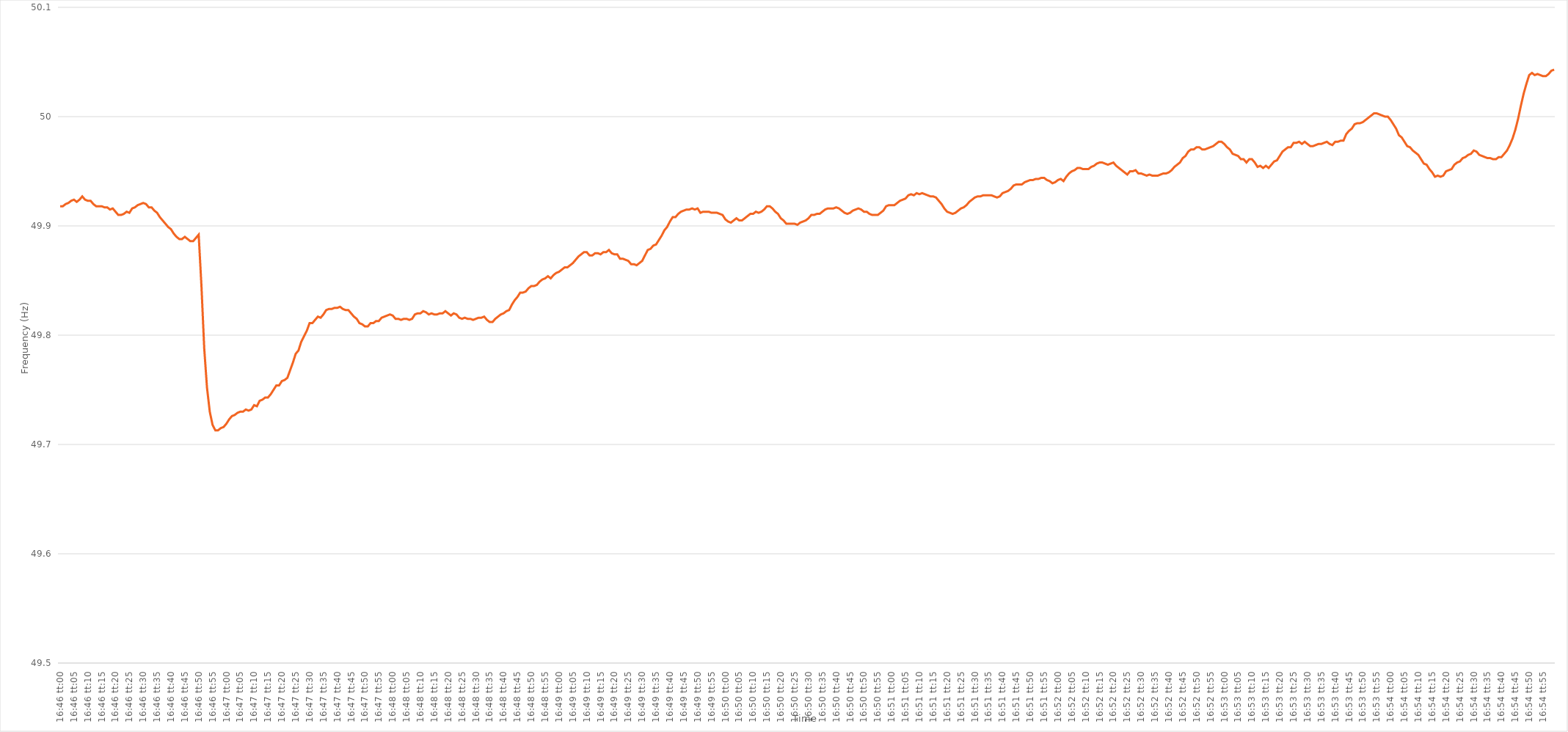
| Category | Series 0 |
|---|---|
| 0.6986111111111111 | 49.918 |
| 0.6986226851851852 | 49.918 |
| 0.6986342592592593 | 49.92 |
| 0.6986458333333333 | 49.921 |
| 0.6986574074074073 | 49.923 |
| 0.6986689814814815 | 49.924 |
| 0.6986805555555556 | 49.922 |
| 0.6986921296296296 | 49.924 |
| 0.6987037037037037 | 49.927 |
| 0.6987152777777778 | 49.924 |
| 0.6987268518518519 | 49.923 |
| 0.6987384259259258 | 49.923 |
| 0.69875 | 49.92 |
| 0.6987615740740741 | 49.918 |
| 0.6987731481481482 | 49.918 |
| 0.6987847222222222 | 49.918 |
| 0.6987962962962962 | 49.917 |
| 0.6988078703703704 | 49.917 |
| 0.6988194444444445 | 49.915 |
| 0.6988310185185185 | 49.916 |
| 0.6988425925925926 | 49.913 |
| 0.6988541666666667 | 49.91 |
| 0.6988657407407407 | 49.91 |
| 0.6988773148148147 | 49.911 |
| 0.6988888888888889 | 49.913 |
| 0.698900462962963 | 49.912 |
| 0.698912037037037 | 49.916 |
| 0.6989236111111111 | 49.917 |
| 0.6989351851851852 | 49.919 |
| 0.6989467592592593 | 49.92 |
| 0.6989583333333332 | 49.921 |
| 0.6989699074074074 | 49.92 |
| 0.6989814814814815 | 49.917 |
| 0.6989930555555556 | 49.917 |
| 0.6990046296296296 | 49.914 |
| 0.6990162037037037 | 49.912 |
| 0.6990277777777778 | 49.908 |
| 0.699039351851852 | 49.905 |
| 0.6990509259259259 | 49.902 |
| 0.6990625 | 49.899 |
| 0.6990740740740741 | 49.897 |
| 0.6990856481481481 | 49.893 |
| 0.6990972222222221 | 49.89 |
| 0.6991087962962963 | 49.888 |
| 0.6991203703703704 | 49.888 |
| 0.6991319444444444 | 49.89 |
| 0.6991435185185185 | 49.888 |
| 0.6991550925925926 | 49.886 |
| 0.6991666666666667 | 49.886 |
| 0.6991782407407406 | 49.889 |
| 0.6991898148148148 | 49.892 |
| 0.6992013888888889 | 49.845 |
| 0.699212962962963 | 49.788 |
| 0.699224537037037 | 49.752 |
| 0.6992361111111111 | 49.73 |
| 0.6992476851851852 | 49.718 |
| 0.6992592592592594 | 49.713 |
| 0.6992708333333333 | 49.713 |
| 0.6992824074074074 | 49.715 |
| 0.6992939814814815 | 49.716 |
| 0.6993055555555556 | 49.719 |
| 0.6993171296296296 | 49.723 |
| 0.6993287037037037 | 49.726 |
| 0.6993402777777779 | 49.727 |
| 0.6993518518518519 | 49.729 |
| 0.6993634259259259 | 49.73 |
| 0.699375 | 49.73 |
| 0.6993865740740741 | 49.732 |
| 0.699398148148148 | 49.731 |
| 0.6994097222222222 | 49.732 |
| 0.6994212962962963 | 49.736 |
| 0.6994328703703704 | 49.735 |
| 0.6994444444444444 | 49.74 |
| 0.6994560185185185 | 49.741 |
| 0.6994675925925926 | 49.743 |
| 0.6994791666666668 | 49.743 |
| 0.6994907407407407 | 49.746 |
| 0.6995023148148148 | 49.75 |
| 0.6995138888888889 | 49.754 |
| 0.699525462962963 | 49.754 |
| 0.699537037037037 | 49.758 |
| 0.6995486111111111 | 49.759 |
| 0.6995601851851853 | 49.761 |
| 0.6995717592592593 | 49.768 |
| 0.6995833333333333 | 49.775 |
| 0.6995949074074074 | 49.783 |
| 0.6996064814814815 | 49.786 |
| 0.6996180555555555 | 49.794 |
| 0.6996296296296296 | 49.799 |
| 0.6996412037037038 | 49.804 |
| 0.6996527777777778 | 49.811 |
| 0.6996643518518518 | 49.811 |
| 0.6996759259259259 | 49.814 |
| 0.6996875 | 49.817 |
| 0.6996990740740742 | 49.816 |
| 0.6997106481481481 | 49.819 |
| 0.6997222222222222 | 49.823 |
| 0.6997337962962963 | 49.824 |
| 0.6997453703703704 | 49.824 |
| 0.6997569444444444 | 49.825 |
| 0.6997685185185185 | 49.825 |
| 0.6997800925925927 | 49.826 |
| 0.6997916666666667 | 49.824 |
| 0.6998032407407407 | 49.823 |
| 0.6998148148148148 | 49.823 |
| 0.6998263888888889 | 49.82 |
| 0.6998379629629629 | 49.817 |
| 0.699849537037037 | 49.815 |
| 0.6998611111111112 | 49.811 |
| 0.6998726851851852 | 49.81 |
| 0.6998842592592592 | 49.808 |
| 0.6998958333333333 | 49.808 |
| 0.6999074074074074 | 49.811 |
| 0.6999189814814816 | 49.811 |
| 0.6999305555555555 | 49.813 |
| 0.6999421296296297 | 49.813 |
| 0.6999537037037037 | 49.816 |
| 0.6999652777777778 | 49.817 |
| 0.6999768518518518 | 49.818 |
| 0.6999884259259259 | 49.819 |
| 0.7000000000000001 | 49.818 |
| 0.7000115740740741 | 49.815 |
| 0.7000231481481481 | 49.815 |
| 0.7000347222222222 | 49.814 |
| 0.7000462962962963 | 49.815 |
| 0.7000578703703703 | 49.815 |
| 0.7000694444444444 | 49.814 |
| 0.7000810185185186 | 49.815 |
| 0.7000925925925926 | 49.819 |
| 0.7001041666666666 | 49.82 |
| 0.7001157407407407 | 49.82 |
| 0.7001273148148148 | 49.822 |
| 0.700138888888889 | 49.821 |
| 0.7001504629629629 | 49.819 |
| 0.700162037037037 | 49.82 |
| 0.7001736111111111 | 49.819 |
| 0.7001851851851852 | 49.819 |
| 0.7001967592592592 | 49.82 |
| 0.7002083333333333 | 49.82 |
| 0.7002199074074075 | 49.822 |
| 0.7002314814814815 | 49.82 |
| 0.7002430555555555 | 49.818 |
| 0.7002546296296296 | 49.82 |
| 0.7002662037037037 | 49.819 |
| 0.7002777777777777 | 49.816 |
| 0.7002893518518518 | 49.815 |
| 0.700300925925926 | 49.816 |
| 0.7003125 | 49.815 |
| 0.700324074074074 | 49.815 |
| 0.7003356481481481 | 49.814 |
| 0.7003472222222222 | 49.815 |
| 0.7003587962962964 | 49.816 |
| 0.7003703703703703 | 49.816 |
| 0.7003819444444445 | 49.817 |
| 0.7003935185185185 | 49.814 |
| 0.7004050925925926 | 49.812 |
| 0.7004166666666666 | 49.812 |
| 0.7004282407407407 | 49.815 |
| 0.7004398148148149 | 49.817 |
| 0.7004513888888889 | 49.819 |
| 0.700462962962963 | 49.82 |
| 0.700474537037037 | 49.822 |
| 0.7004861111111111 | 49.823 |
| 0.7004976851851853 | 49.828 |
| 0.7005092592592592 | 49.832 |
| 0.7005208333333334 | 49.835 |
| 0.7005324074074074 | 49.839 |
| 0.7005439814814814 | 49.839 |
| 0.7005555555555555 | 49.84 |
| 0.7005671296296296 | 49.843 |
| 0.7005787037037038 | 49.845 |
| 0.7005902777777777 | 49.845 |
| 0.7006018518518519 | 49.846 |
| 0.7006134259259259 | 49.849 |
| 0.700625 | 49.851 |
| 0.700636574074074 | 49.852 |
| 0.7006481481481481 | 49.854 |
| 0.7006597222222223 | 49.852 |
| 0.7006712962962963 | 49.855 |
| 0.7006828703703704 | 49.857 |
| 0.7006944444444444 | 49.858 |
| 0.7007060185185185 | 49.86 |
| 0.7007175925925927 | 49.862 |
| 0.7007291666666666 | 49.862 |
| 0.7007407407407408 | 49.864 |
| 0.7007523148148148 | 49.866 |
| 0.700763888888889 | 49.869 |
| 0.7007754629629629 | 49.872 |
| 0.700787037037037 | 49.874 |
| 0.7007986111111112 | 49.876 |
| 0.7008101851851851 | 49.876 |
| 0.7008217592592593 | 49.873 |
| 0.7008333333333333 | 49.873 |
| 0.7008449074074075 | 49.875 |
| 0.7008564814814814 | 49.875 |
| 0.7008680555555555 | 49.874 |
| 0.7008796296296297 | 49.876 |
| 0.7008912037037037 | 49.876 |
| 0.7009027777777778 | 49.878 |
| 0.7009143518518518 | 49.875 |
| 0.700925925925926 | 49.874 |
| 0.7009375000000001 | 49.874 |
| 0.700949074074074 | 49.87 |
| 0.7009606481481482 | 49.87 |
| 0.7009722222222222 | 49.869 |
| 0.7009837962962964 | 49.868 |
| 0.7009953703703703 | 49.865 |
| 0.7010069444444444 | 49.865 |
| 0.7010185185185186 | 49.864 |
| 0.7010300925925925 | 49.866 |
| 0.7010416666666667 | 49.868 |
| 0.7010532407407407 | 49.873 |
| 0.7010648148148149 | 49.878 |
| 0.7010763888888888 | 49.879 |
| 0.7010879629629629 | 49.882 |
| 0.7010995370370371 | 49.883 |
| 0.7011111111111111 | 49.887 |
| 0.7011226851851852 | 49.891 |
| 0.7011342592592592 | 49.896 |
| 0.7011458333333334 | 49.899 |
| 0.7011574074074075 | 49.904 |
| 0.7011689814814814 | 49.908 |
| 0.7011805555555556 | 49.908 |
| 0.7011921296296296 | 49.911 |
| 0.7012037037037038 | 49.913 |
| 0.7012152777777777 | 49.914 |
| 0.7012268518518519 | 49.915 |
| 0.701238425925926 | 49.915 |
| 0.7012499999999999 | 49.916 |
| 0.7012615740740741 | 49.915 |
| 0.7012731481481481 | 49.916 |
| 0.7012847222222223 | 49.912 |
| 0.7012962962962962 | 49.913 |
| 0.7013078703703703 | 49.913 |
| 0.7013194444444445 | 49.913 |
| 0.7013310185185185 | 49.912 |
| 0.7013425925925926 | 49.912 |
| 0.7013541666666666 | 49.912 |
| 0.7013657407407408 | 49.911 |
| 0.7013773148148149 | 49.91 |
| 0.7013888888888888 | 49.906 |
| 0.701400462962963 | 49.904 |
| 0.701412037037037 | 49.903 |
| 0.7014236111111112 | 49.905 |
| 0.7014351851851851 | 49.907 |
| 0.7014467592592593 | 49.905 |
| 0.7014583333333334 | 49.905 |
| 0.7014699074074073 | 49.907 |
| 0.7014814814814815 | 49.909 |
| 0.7014930555555555 | 49.911 |
| 0.7015046296296297 | 49.911 |
| 0.7015162037037036 | 49.913 |
| 0.7015277777777778 | 49.912 |
| 0.7015393518518519 | 49.913 |
| 0.7015509259259259 | 49.915 |
| 0.7015625 | 49.918 |
| 0.701574074074074 | 49.918 |
| 0.7015856481481482 | 49.916 |
| 0.7015972222222223 | 49.913 |
| 0.7016087962962962 | 49.911 |
| 0.7016203703703704 | 49.907 |
| 0.7016319444444444 | 49.905 |
| 0.7016435185185186 | 49.902 |
| 0.7016550925925925 | 49.902 |
| 0.7016666666666667 | 49.902 |
| 0.7016782407407408 | 49.902 |
| 0.7016898148148147 | 49.901 |
| 0.7017013888888889 | 49.903 |
| 0.7017129629629629 | 49.904 |
| 0.7017245370370371 | 49.905 |
| 0.701736111111111 | 49.907 |
| 0.7017476851851852 | 49.91 |
| 0.7017592592592593 | 49.91 |
| 0.7017708333333333 | 49.911 |
| 0.7017824074074074 | 49.911 |
| 0.7017939814814814 | 49.913 |
| 0.7018055555555556 | 49.915 |
| 0.7018171296296297 | 49.916 |
| 0.7018287037037036 | 49.916 |
| 0.7018402777777778 | 49.916 |
| 0.7018518518518518 | 49.917 |
| 0.701863425925926 | 49.916 |
| 0.7018749999999999 | 49.914 |
| 0.7018865740740741 | 49.912 |
| 0.7018981481481482 | 49.911 |
| 0.7019097222222223 | 49.912 |
| 0.7019212962962963 | 49.914 |
| 0.7019328703703703 | 49.915 |
| 0.7019444444444445 | 49.916 |
| 0.7019560185185186 | 49.915 |
| 0.7019675925925926 | 49.913 |
| 0.7019791666666667 | 49.913 |
| 0.7019907407407407 | 49.911 |
| 0.7020023148148148 | 49.91 |
| 0.7020138888888888 | 49.91 |
| 0.702025462962963 | 49.91 |
| 0.7020370370370371 | 49.912 |
| 0.702048611111111 | 49.914 |
| 0.7020601851851852 | 49.918 |
| 0.7020717592592592 | 49.919 |
| 0.7020833333333334 | 49.919 |
| 0.7020949074074073 | 49.919 |
| 0.7021064814814815 | 49.921 |
| 0.7021180555555556 | 49.923 |
| 0.7021296296296297 | 49.924 |
| 0.7021412037037037 | 49.925 |
| 0.7021527777777777 | 49.928 |
| 0.7021643518518519 | 49.929 |
| 0.702175925925926 | 49.928 |
| 0.7021875 | 49.93 |
| 0.7021990740740741 | 49.929 |
| 0.7022106481481482 | 49.93 |
| 0.7022222222222222 | 49.929 |
| 0.7022337962962962 | 49.928 |
| 0.7022453703703704 | 49.927 |
| 0.7022569444444445 | 49.927 |
| 0.7022685185185185 | 49.926 |
| 0.7022800925925926 | 49.923 |
| 0.7022916666666666 | 49.92 |
| 0.7023032407407408 | 49.916 |
| 0.7023148148148147 | 49.913 |
| 0.7023263888888889 | 49.912 |
| 0.702337962962963 | 49.911 |
| 0.7023495370370371 | 49.912 |
| 0.7023611111111111 | 49.914 |
| 0.7023726851851851 | 49.916 |
| 0.7023842592592593 | 49.917 |
| 0.7023958333333334 | 49.919 |
| 0.7024074074074074 | 49.922 |
| 0.7024189814814815 | 49.924 |
| 0.7024305555555556 | 49.926 |
| 0.7024421296296296 | 49.927 |
| 0.7024537037037036 | 49.927 |
| 0.7024652777777778 | 49.928 |
| 0.7024768518518519 | 49.928 |
| 0.7024884259259259 | 49.928 |
| 0.7025 | 49.928 |
| 0.702511574074074 | 49.927 |
| 0.7025231481481482 | 49.926 |
| 0.7025347222222221 | 49.927 |
| 0.7025462962962963 | 49.93 |
| 0.7025578703703704 | 49.931 |
| 0.7025694444444445 | 49.932 |
| 0.7025810185185185 | 49.934 |
| 0.7025925925925925 | 49.937 |
| 0.7026041666666667 | 49.938 |
| 0.7026157407407408 | 49.938 |
| 0.7026273148148148 | 49.938 |
| 0.7026388888888889 | 49.94 |
| 0.702650462962963 | 49.941 |
| 0.702662037037037 | 49.942 |
| 0.702673611111111 | 49.942 |
| 0.7026851851851852 | 49.943 |
| 0.7026967592592593 | 49.943 |
| 0.7027083333333333 | 49.944 |
| 0.7027199074074074 | 49.944 |
| 0.7027314814814815 | 49.942 |
| 0.7027430555555556 | 49.941 |
| 0.7027546296296295 | 49.939 |
| 0.7027662037037037 | 49.94 |
| 0.7027777777777778 | 49.942 |
| 0.7027893518518519 | 49.943 |
| 0.7028009259259259 | 49.941 |
| 0.7028125 | 49.945 |
| 0.7028240740740741 | 49.948 |
| 0.7028356481481483 | 49.95 |
| 0.7028472222222222 | 49.951 |
| 0.7028587962962963 | 49.953 |
| 0.7028703703703704 | 49.953 |
| 0.7028819444444444 | 49.952 |
| 0.7028935185185184 | 49.952 |
| 0.7029050925925926 | 49.952 |
| 0.7029166666666667 | 49.954 |
| 0.7029282407407407 | 49.955 |
| 0.7029398148148148 | 49.957 |
| 0.7029513888888889 | 49.958 |
| 0.702962962962963 | 49.958 |
| 0.7029745370370369 | 49.957 |
| 0.7029861111111111 | 49.956 |
| 0.7029976851851852 | 49.957 |
| 0.7030092592592593 | 49.958 |
| 0.7030208333333333 | 49.955 |
| 0.7030324074074074 | 49.953 |
| 0.7030439814814815 | 49.951 |
| 0.7030555555555557 | 49.949 |
| 0.7030671296296296 | 49.947 |
| 0.7030787037037037 | 49.95 |
| 0.7030902777777778 | 49.95 |
| 0.7031018518518519 | 49.951 |
| 0.7031134259259259 | 49.948 |
| 0.703125 | 49.948 |
| 0.7031365740740741 | 49.947 |
| 0.7031481481481481 | 49.946 |
| 0.7031597222222222 | 49.947 |
| 0.7031712962962963 | 49.946 |
| 0.7031828703703704 | 49.946 |
| 0.7031944444444443 | 49.946 |
| 0.7032060185185185 | 49.947 |
| 0.7032175925925926 | 49.948 |
| 0.7032291666666667 | 49.948 |
| 0.7032407407407407 | 49.949 |
| 0.7032523148148148 | 49.951 |
| 0.7032638888888889 | 49.954 |
| 0.7032754629629631 | 49.956 |
| 0.703287037037037 | 49.958 |
| 0.7032986111111111 | 49.962 |
| 0.7033101851851852 | 49.964 |
| 0.7033217592592593 | 49.968 |
| 0.7033333333333333 | 49.97 |
| 0.7033449074074074 | 49.97 |
| 0.7033564814814816 | 49.972 |
| 0.7033680555555556 | 49.972 |
| 0.7033796296296296 | 49.97 |
| 0.7033912037037037 | 49.97 |
| 0.7034027777777778 | 49.971 |
| 0.7034143518518517 | 49.972 |
| 0.7034259259259259 | 49.973 |
| 0.7034375 | 49.975 |
| 0.7034490740740741 | 49.977 |
| 0.7034606481481481 | 49.977 |
| 0.7034722222222222 | 49.975 |
| 0.7034837962962963 | 49.972 |
| 0.7034953703703705 | 49.97 |
| 0.7035069444444444 | 49.966 |
| 0.7035185185185185 | 49.965 |
| 0.7035300925925926 | 49.964 |
| 0.7035416666666667 | 49.961 |
| 0.7035532407407407 | 49.961 |
| 0.7035648148148148 | 49.958 |
| 0.703576388888889 | 49.961 |
| 0.703587962962963 | 49.961 |
| 0.703599537037037 | 49.958 |
| 0.7036111111111111 | 49.954 |
| 0.7036226851851852 | 49.955 |
| 0.7036342592592592 | 49.953 |
| 0.7036458333333333 | 49.955 |
| 0.7036574074074075 | 49.953 |
| 0.7036689814814815 | 49.956 |
| 0.7036805555555555 | 49.959 |
| 0.7036921296296296 | 49.96 |
| 0.7037037037037037 | 49.964 |
| 0.7037152777777779 | 49.968 |
| 0.7037268518518518 | 49.97 |
| 0.703738425925926 | 49.972 |
| 0.70375 | 49.972 |
| 0.7037615740740741 | 49.976 |
| 0.7037731481481481 | 49.976 |
| 0.7037847222222222 | 49.977 |
| 0.7037962962962964 | 49.975 |
| 0.7038078703703704 | 49.977 |
| 0.7038194444444444 | 49.975 |
| 0.7038310185185185 | 49.973 |
| 0.7038425925925926 | 49.973 |
| 0.7038541666666666 | 49.974 |
| 0.7038657407407407 | 49.975 |
| 0.7038773148148149 | 49.975 |
| 0.7038888888888889 | 49.976 |
| 0.7039004629629629 | 49.977 |
| 0.703912037037037 | 49.975 |
| 0.7039236111111111 | 49.974 |
| 0.7039351851851853 | 49.977 |
| 0.7039467592592592 | 49.977 |
| 0.7039583333333334 | 49.978 |
| 0.7039699074074074 | 49.978 |
| 0.7039814814814815 | 49.984 |
| 0.7039930555555555 | 49.987 |
| 0.7040046296296296 | 49.989 |
| 0.7040162037037038 | 49.993 |
| 0.7040277777777778 | 49.994 |
| 0.7040393518518518 | 49.994 |
| 0.7040509259259259 | 49.995 |
| 0.7040625 | 49.997 |
| 0.704074074074074 | 49.999 |
| 0.7040856481481481 | 50.001 |
| 0.7040972222222223 | 50.003 |
| 0.7041087962962963 | 50.003 |
| 0.7041203703703703 | 50.002 |
| 0.7041319444444444 | 50.001 |
| 0.7041435185185185 | 50 |
| 0.7041550925925927 | 50 |
| 0.7041666666666666 | 49.997 |
| 0.7041782407407408 | 49.993 |
| 0.7041898148148148 | 49.989 |
| 0.704201388888889 | 49.983 |
| 0.7042129629629629 | 49.981 |
| 0.704224537037037 | 49.977 |
| 0.7042361111111112 | 49.973 |
| 0.7042476851851852 | 49.972 |
| 0.7042592592592593 | 49.969 |
| 0.7042708333333333 | 49.967 |
| 0.7042824074074074 | 49.965 |
| 0.7042939814814814 | 49.961 |
| 0.7043055555555555 | 49.957 |
| 0.7043171296296297 | 49.956 |
| 0.7043287037037037 | 49.952 |
| 0.7043402777777777 | 49.949 |
| 0.7043518518518518 | 49.945 |
| 0.7043634259259259 | 49.946 |
| 0.7043750000000001 | 49.945 |
| 0.704386574074074 | 49.946 |
| 0.7043981481481482 | 49.95 |
| 0.7044097222222222 | 49.951 |
| 0.7044212962962964 | 49.952 |
| 0.7044328703703703 | 49.956 |
| 0.7044444444444444 | 49.958 |
| 0.7044560185185186 | 49.959 |
| 0.7044675925925926 | 49.962 |
| 0.7044791666666667 | 49.963 |
| 0.7044907407407407 | 49.965 |
| 0.7045023148148148 | 49.966 |
| 0.704513888888889 | 49.969 |
| 0.7045254629629629 | 49.968 |
| 0.7045370370370371 | 49.965 |
| 0.7045486111111111 | 49.964 |
| 0.7045601851851853 | 49.963 |
| 0.7045717592592592 | 49.962 |
| 0.7045833333333333 | 49.962 |
| 0.7045949074074075 | 49.961 |
| 0.7046064814814814 | 49.961 |
| 0.7046180555555556 | 49.963 |
| 0.7046296296296296 | 49.963 |
| 0.7046412037037038 | 49.966 |
| 0.7046527777777777 | 49.969 |
| 0.7046643518518518 | 49.974 |
| 0.704675925925926 | 49.98 |
| 0.7046875 | 49.988 |
| 0.7046990740740741 | 49.998 |
| 0.7047106481481481 | 50.01 |
| 0.7047222222222222 | 50.021 |
| 0.7047337962962964 | 50.03 |
| 0.7047453703703703 | 50.038 |
| 0.7047569444444445 | 50.04 |
| 0.7047685185185185 | 50.038 |
| 0.7047800925925927 | 50.039 |
| 0.7047916666666666 | 50.038 |
| 0.7048032407407407 | 50.037 |
| 0.7048148148148149 | 50.037 |
| 0.7048263888888888 | 50.039 |
| 0.704837962962963 | 50.042 |
| 0.704849537037037 | 50.043 |